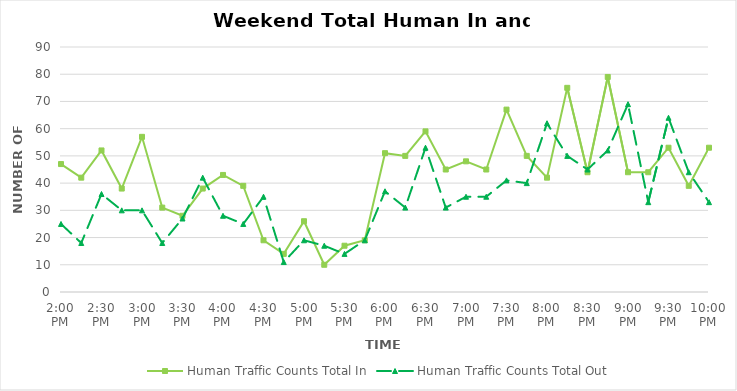
| Category | Human Traffic Counts Total In | Human Traffic Counts Total Out |
|---|---|---|
| 0.5833333333333334 | 47 | 25 |
| 0.59375 | 42 | 18 |
| 0.604166666666667 | 52 | 36 |
| 0.614583333333333 | 38 | 30 |
| 0.625 | 57 | 30 |
| 0.635416666666666 | 31 | 18 |
| 0.645833333333333 | 28 | 27 |
| 0.65625 | 38 | 42 |
| 0.666666666666666 | 43 | 28 |
| 0.677083333333333 | 39 | 25 |
| 0.6875 | 19 | 35 |
| 0.697916666666666 | 14 | 11 |
| 0.708333333333333 | 26 | 19 |
| 0.718749999999999 | 10 | 17 |
| 0.729166666666666 | 17 | 14 |
| 0.739583333333333 | 19 | 19 |
| 0.75 | 51 | 37 |
| 0.7604166666666666 | 50 | 31 |
| 0.7708333333333334 | 59 | 53 |
| 0.78125 | 45 | 31 |
| 0.7916666666666666 | 48 | 35 |
| 0.8020833333333334 | 45 | 35 |
| 0.8125 | 67 | 41 |
| 0.8229166666666666 | 50 | 40 |
| 0.8333333333333334 | 42 | 62 |
| 0.84375 | 75 | 50 |
| 0.8541666666666666 | 44 | 45 |
| 0.8645833333333334 | 79 | 52 |
| 0.875 | 44 | 69 |
| 0.8854166666666666 | 44 | 33 |
| 0.8958333333333334 | 53 | 64 |
| 0.90625 | 39 | 44 |
| 0.9166666666666666 | 53 | 33 |